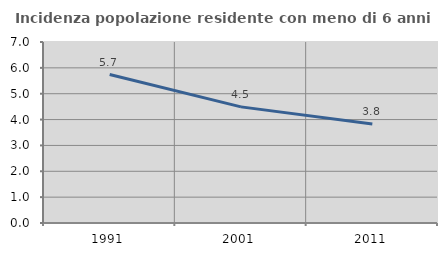
| Category | Incidenza popolazione residente con meno di 6 anni |
|---|---|
| 1991.0 | 5.741 |
| 2001.0 | 4.491 |
| 2011.0 | 3.827 |